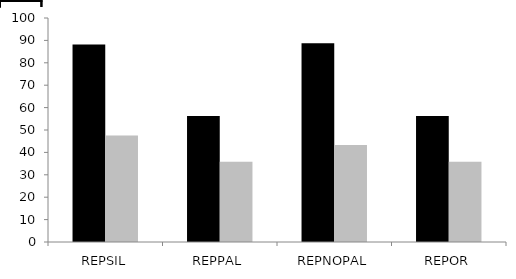
| Category | grupo control | grupo TEL |
|---|---|---|
| REPSIL | 88.125 | 47.5 |
| REPPAL | 56.25 | 35.833 |
| REPNOPAL | 88.75 | 43.333 |
| REPOR | 56.25 | 35.833 |